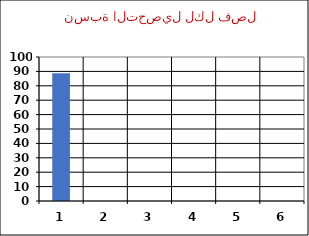
| Category | نسبة التحصيل |
|---|---|
| 0 | 88.793 |
| 1 | 0 |
| 2 | 0 |
| 3 | 0 |
| 4 | 0 |
| 5 | 0 |